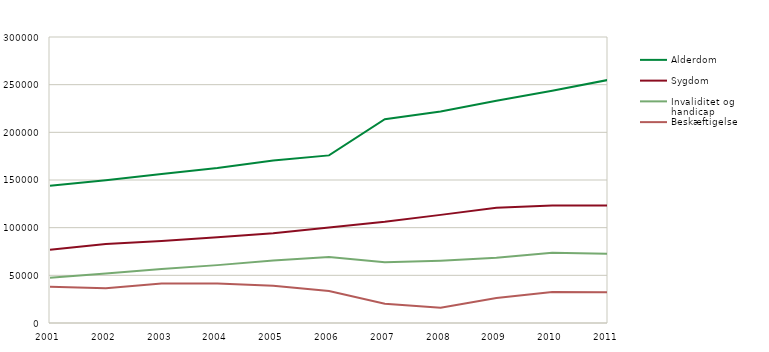
| Category | Alderdom | Sygdom   | Invaliditet og handicap   | Beskæftigelse   |
|---|---|---|---|---|
| 2001 | 143892 | 76843 | 47352 | 37951 |
| 2002 | 149711 | 82782 | 51899 | 36552 |
| 2003 | 156267 | 86125 | 56589 | 41337 |
| 2004 | 162584 | 90001 | 60707 | 41399 |
| 2005 | 170373 | 94124 | 65498 | 38956 |
| 2006 | 175806 | 100163 | 69228 | 33459 |
| 2007 | 213745 | 106100 | 63629 | 20093 |
| 2008 | 221954 | 113419 | 65412 | 16025 |
| 2009 | 233029 | 120860 | 68399 | 26300 |
| 2010 | 243506 | 123127 | 73636 | 32420 |
| 2011 | 254973 | 123229 | 72571 | 32137 |